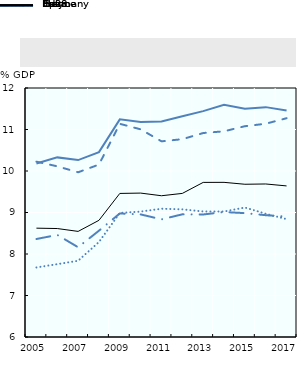
| Category | France | Germany | Italy | Spain | EU28 |
|---|---|---|---|---|---|
| 2005.0 | 10.18 | 10.225 | 8.361 | 7.676 | 8.622 |
| nan | 10.328 | 10.113 | 8.46 | 7.755 | 8.614 |
| 2007.0 | 10.263 | 9.969 | 8.163 | 7.837 | 8.545 |
| nan | 10.454 | 10.155 | 8.562 | 8.289 | 8.812 |
| 2009.0 | 11.244 | 11.137 | 8.977 | 8.989 | 9.459 |
| nan | 11.179 | 11.004 | 8.954 | 9.022 | 9.468 |
| 2011.0 | 11.194 | 10.715 | 8.835 | 9.091 | 9.404 |
| nan | 11.321 | 10.767 | 8.956 | 9.076 | 9.46 |
| 2013.0 | 11.442 | 10.915 | 8.952 | 9.025 | 9.725 |
| nan | 11.595 | 10.957 | 9.011 | 9.024 | 9.726 |
| 2015.0 | 11.501 | 11.079 | 8.985 | 9.12 | 9.681 |
| nan | 11.539 | 11.139 | 8.935 | 8.97 | 9.687 |
| 2017.0 | 11.458 | 11.272 | 8.901 | 8.841 | 9.641 |